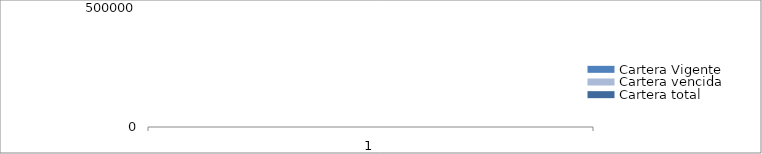
| Category | Cartera Vigente | Cartera vencida | Cartera total |
|---|---|---|---|
| 0 | 1 | 1 | 1 |